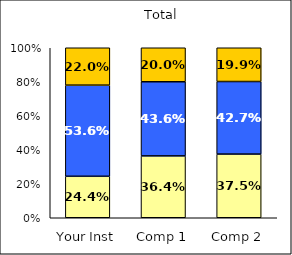
| Category | Low Satisfaction with Courses | Average Satisfaction with Courses | High Satisfaction with Courses |
|---|---|---|---|
| Your Inst | 0.244 | 0.536 | 0.22 |
| Comp 1 | 0.364 | 0.436 | 0.2 |
| Comp 2 | 0.375 | 0.427 | 0.199 |